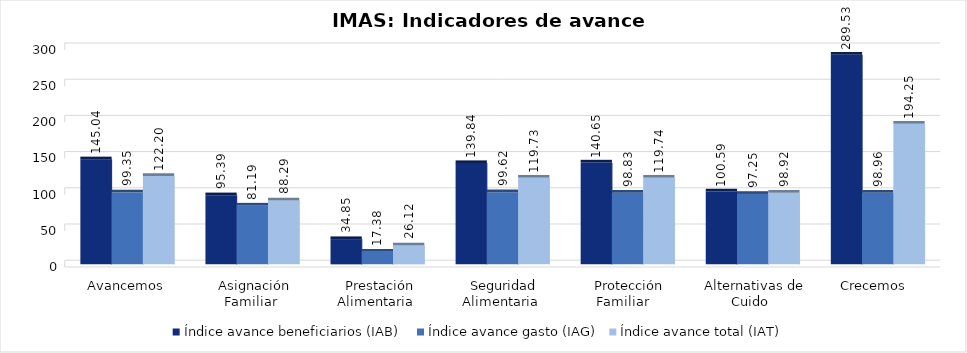
| Category | Índice avance beneficiarios (IAB)  | Índice avance gasto (IAG) | Índice avance total (IAT)  |
|---|---|---|---|
| Avancemos | 145.043 | 99.348 | 122.195 |
| Asignación Familiar | 95.395 | 81.188 | 88.291 |
| Prestación Alimentaria | 34.848 | 17.383 | 26.116 |
| Seguridad Alimentaria | 139.843 | 99.622 | 119.732 |
| Protección Familiar  | 140.647 | 98.83 | 119.738 |
| Alternativas de Cuido | 100.594 | 97.252 | 98.923 |
| Crecemos  | 289.535 | 98.956 | 194.246 |